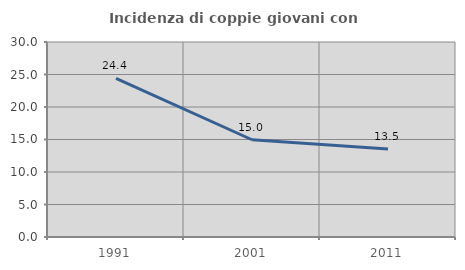
| Category | Incidenza di coppie giovani con figli |
|---|---|
| 1991.0 | 24.409 |
| 2001.0 | 14.961 |
| 2011.0 | 13.534 |